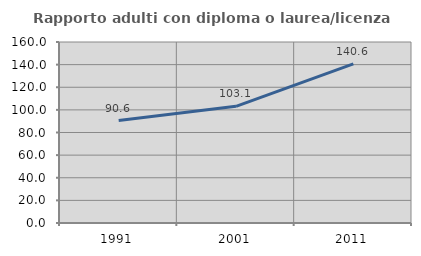
| Category | Rapporto adulti con diploma o laurea/licenza media  |
|---|---|
| 1991.0 | 90.58 |
| 2001.0 | 103.146 |
| 2011.0 | 140.596 |